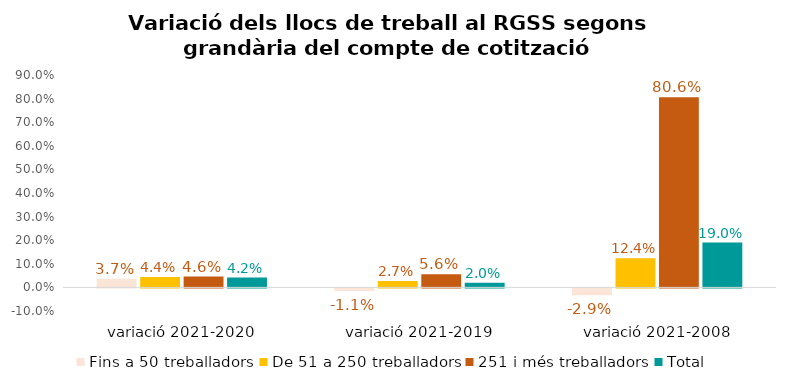
| Category | Fins a 50 treballadors | De 51 a 250 treballadors | 251 i més treballadors | Total |
|---|---|---|---|---|
| variació 2021-2020 | 0.037 | 0.044 | 0.046 | 0.042 |
| variació 2021-2019 | -0.011 | 0.027 | 0.056 | 0.02 |
| variació 2021-2008 | -0.029 | 0.124 | 0.806 | 0.19 |